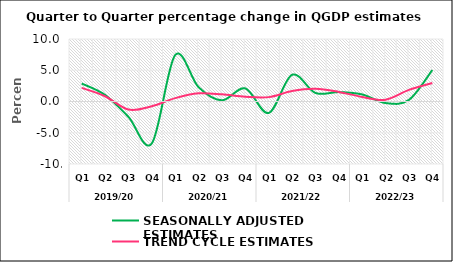
| Category | SEASONALLY ADJUSTED ESTIMATES | TREND CYCLE ESTIMATES |
|---|---|---|
| 0 | 2.878 | 2.175 |
| 1 | 1.05 | 0.842 |
| 2 | -2.454 | -1.283 |
| 3 | -6.708 | -0.749 |
| 4 | 7.424 | 0.544 |
| 5 | 2.289 | 1.308 |
| 6 | 0.189 | 1.146 |
| 7 | 2.098 | 0.763 |
| 8 | -1.835 | 0.701 |
| 9 | 4.264 | 1.669 |
| 10 | 1.367 | 2.023 |
| 11 | 1.506 | 1.531 |
| 12 | 1.128 | 0.727 |
| 13 | -0.247 | 0.284 |
| 14 | 0.256 | 1.855 |
| 15 | 5.029 | 2.955 |